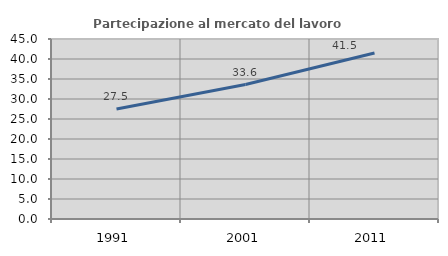
| Category | Partecipazione al mercato del lavoro  femminile |
|---|---|
| 1991.0 | 27.481 |
| 2001.0 | 33.619 |
| 2011.0 | 41.502 |